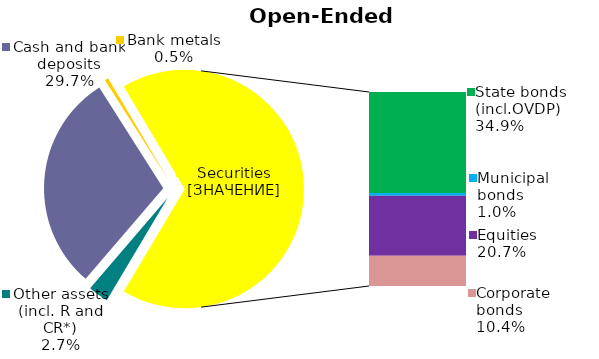
| Category | Series 0 |
|---|---|
| Other assets (incl. R and CR*) | 0.027 |
| Cash and bank deposits | 0.297 |
| Bank metals | 0.005 |
| State bonds (incl.OVDP) | 0.349 |
| Municipal bonds | 0.01 |
| Equities | 0.207 |
| Corporate bonds | 0.104 |